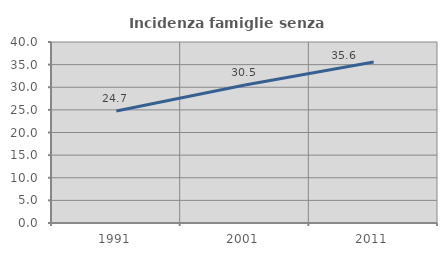
| Category | Incidenza famiglie senza nuclei |
|---|---|
| 1991.0 | 24.731 |
| 2001.0 | 30.497 |
| 2011.0 | 35.567 |